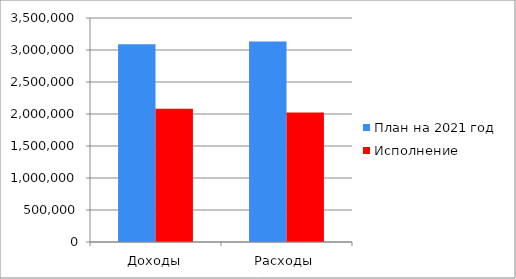
| Category | План на 2021 год | Исполнение |
|---|---|---|
| Доходы | 3091341 | 2080987 |
| Расходы | 3132168 | 2022066 |